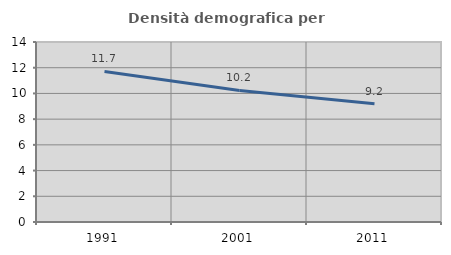
| Category | Densità demografica |
|---|---|
| 1991.0 | 11.709 |
| 2001.0 | 10.234 |
| 2011.0 | 9.19 |